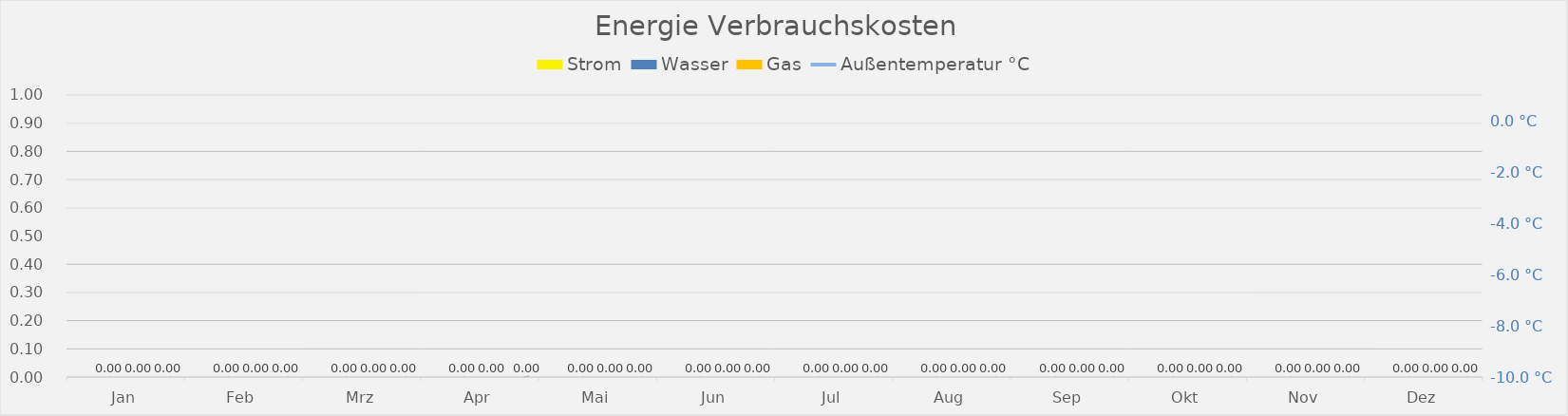
| Category | Series 0 | Strom | Wasser | Gas |
|---|---|---|---|---|
| Jan |  | 0 | 0 | 0 |
| Feb |  | 0 | 0 | 0 |
| Mrz |  | 0 | 0 | 0 |
| Apr |  | 0 | 0 | 0 |
| Mai |  | 0 | 0 | 0 |
| Jun |  | 0 | 0 | 0 |
| Jul |  | 0 | 0 | 0 |
| Aug |  | 0 | 0 | 0 |
| Sep |  | 0 | 0 | 0 |
| Okt |  | 0 | 0 | 0 |
| Nov |  | 0 | 0 | 0 |
| Dez |  | 0 | 0 | 0 |